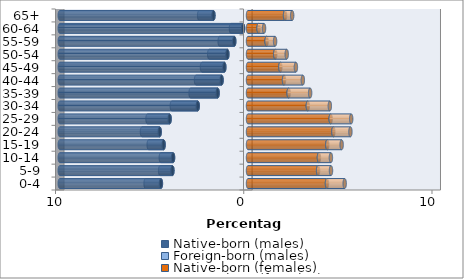
| Category | Native-born (males) | Foreign-born (males) | Native-born (females) | Foreign-born (females) |
|---|---|---|---|---|
| 0-4 | -4.626 | -0.815 | 4.195 | 0.941 |
| 5-9 | -4.015 | -0.653 | 3.723 | 0.686 |
| 10-14 | -3.982 | -0.65 | 3.767 | 0.637 |
| 15-19 | -4.483 | -0.792 | 4.212 | 0.763 |
| 20-24 | -4.691 | -0.94 | 4.535 | 0.905 |
| 25-29 | -4.164 | -1.175 | 4.392 | 1.09 |
| 30-34 | -2.67 | -1.377 | 3.178 | 1.17 |
| 35-39 | -1.614 | -1.436 | 2.16 | 1.14 |
| 40-44 | -1.404 | -1.358 | 1.913 | 1.001 |
| 45-49 | -1.258 | -1.186 | 1.719 | 0.825 |
| 50-54 | -1.096 | -0.965 | 1.446 | 0.61 |
| 55-59 | -0.73 | -0.775 | 0.988 | 0.451 |
| 60-64 | -0.264 | -0.641 | 0.561 | 0.291 |
| 65+ | -1.836 | -0.76 | 1.967 | 0.38 |